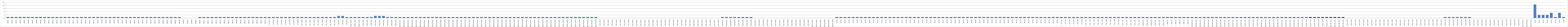
| Category | Series 0 |
|---|---|
| AW01 | 1 |
| AW02 | 1 |
| AW03 | 1 |
| AW04 | 1 |
| AW05 | 1 |
| AW06 | 1 |
| AW07 | 1 |
| AW08 | 1 |
| AW09 | 1 |
| AW10 | 1 |
| AW11 | 1 |
| AW12 | 1 |
| AW13 | 1 |
| AW14 | 1 |
| AW15 | 1 |
| AW16 | 1 |
| AW17 | 1 |
| AW18 | 1 |
| AW19 | 1 |
| AW20 | 1 |
| AW21 | 1 |
| AW22 | 1 |
| AW23 | 1 |
| AW24 | 1 |
| AW25 | 1 |
| AW26 | 1 |
| AW27 | 1 |
| AW28 | 1 |
| AW29 | 1 |
| AW30 | 1 |
| AW31 | 1 |
| AW32 | 1 |
| AW33 | 1 |
| AW34 | 1 |
| AW35 | 1 |
| AW36 | 1 |
| AW37 | 1 |
| AW38 | 1 |
| BW01 | 1 |
| BW02 | 1 |
| BW03 | 1 |
| BWO4 | 1 |
| BW05 | 1 |
| BW06 | 0 |
| BW07 | 0 |
| BW08 | 0 |
| BW09 | 0 |
| BW10 | 1 |
| BW11 | 1 |
| BW12 | 1 |
| BW13 | 1 |
| BW14 | 1 |
| BW15 | 1 |
| BW16 | 1 |
| BW17 | 1 |
| BW18 | 1 |
| BW19 | 1 |
| BW20 | 1 |
| BW21 | 1 |
| BW22 | 1 |
| BW23 | 1 |
| BW24 | 1 |
| BW25 | 1 |
| BW26 | 1 |
| OS.W01 | 1 |
| OS.W02 | 1 |
| OS.W03 | 1 |
| OS.W04 | 1 |
| OS.W05 | 1 |
| OS.W06 | 1 |
| OS.W07 | 1 |
| OS.W08 | 1 |
| OE. W01 | 1 |
| OE. W02 | 1 |
| OE. W03 | 1 |
| OE. W04 | 1 |
| OE. W05 | 1 |
| OE. W06 | 1 |
| OE. W07 | 1 |
| OE. W08 | 1 |
| OE. W09 | 1 |
| OA.W01 | 2 |
| OA.W02 | 2 |
| OA.W03 | 1 |
| OAN. W01 | 1 |
| OAN. W02 | 1 |
| OAN. W03 | 1 |
| OZŚ.W01 | 1 |
| OZŚ.W02 | 1 |
| OZŚ.W03 | 1 |
| OPE.W01 | 2 |
| OPE.W02 | 2 |
| OPE.W03 | 2 |
| OPE.W04 | 1 |
| OPE.W05 | 1 |
| OPE.W06 | 1 |
| B1OD.W01 | 1 |
| B1OD.W02 | 1 |
| B1OD.W03 | 1 |
| B1OD.W04 | 1 |
| B1OD.W05 | 1 |
| B1OD.W06 | 1 |
| B1OD.W07 | 1 |
| B1PZ.W01 | 1 |
| B1PZ.W02 | 1 |
| B1PZ.W03 | 1 |
| B1PZ.W04 | 1 |
| B1PZ.W05 | 1 |
| B1PZ.W06 | 1 |
| B1PZ.W07 | 1 |
| B1PZ.W08 | 1 |
| B1PS.W01 | 1 |
| B1PS.W02 | 1 |
| B1PS.W03 | 1 |
| B1PS.W04 | 1 |
| B1PS.W05 | 1 |
| B1PS.W06 | 1 |
| B1PS.W07 | 1 |
| B1PS.W08 | 1 |
| B1MŚ.W01 | 1 |
| B1MŚ.W02 | 1 |
| B1MŚ.W03 | 1 |
| B1MŚ.W04 | 1 |
| B1MŚ.W05 | 1 |
| B1MŚ.W06 | 1 |
| B1MŚ.W07 | 1 |
| B1MŚ.W08 | 1 |
| B1PO.W01 | 1 |
| B1PO.W02 | 1 |
| B1PO.W03 | 1 |
| B1PO.W04 | 1 |
| B1PO.W05 | 1 |
| B1PO.W06 | 1 |
| B1PO.W07 | 1 |
| B1PO.W08 | 1 |
| B1EL.W01 | 1 |
| B1EL.W02 | 1 |
| B1EL.W03 | 1 |
| B1EL.W04 | 1 |
| B1EL.W05 | 1 |
| B1EL.W06 | 1 |
| B1.PR.W01 | 1 |
| B1.PR.W02 | 1 |
| B1.PR.W03 | 1 |
| B1.PR.W04 | 1 |
| B1S.W01 | 0 |
| B1S.W02 | 0 |
| B1S.W03 | 0 |
| B1S.W04 | 0 |
| B1S.W05 | 0 |
| B1S.W06 | 0 |
| B1S.W07 | 0 |
| B1S.W08 | 0 |
| B2C.W01 | 0 |
| B2C.W02 | 0 |
| B2C.W03 | 0 |
| B2C.W04 | 0 |
| B2C.W05 | 0 |
| B2C.W06 | 0 |
| B2C.W07 | 0 |
| B2C.W08 | 0 |
| B2K.W01 | 0 |
| B2K.W02 | 0 |
| B2K.W03 | 0 |
| B2K.W04 | 0 |
| B2K.W05 | 0 |
| B2K.W06 | 0 |
| B2U.W01 | 0 |
| B2U.W02 | 0 |
| B2U.W03 | 0 |
| B2U.W04 | 0 |
| B2U.W05 | 0 |
| B2U.W06 | 0 |
| B2U.W07 | 0 |
| B2U.W08 | 0 |
| B2N.W01 | 1 |
| B2N.W02 | 1 |
| B2N.W03 | 1 |
| B2N.W04 | 1 |
| B2N.W05 | 1 |
| B2N.W06 | 1 |
| B2N.W07 | 1 |
| B2N.W08 | 1 |
| B2O.W01 | 0 |
| B2O.W02 | 0 |
| B2O.W03 | 0 |
| B2O.W04 | 0 |
| B2O.W05 | 0 |
| B2O.W06 | 0 |
| B2O.W07 | 0 |
| B2O.W08 | 0 |
| B2O.W09 | 0 |
| B2D.W01 | 0 |
| B2D.W02 | 0 |
| B2D.W03 | 0 |
| B2D.W04 | 0 |
| B2D.W05 | 0 |
| B2CH.W01 | 0 |
| B2CH.W02 | 0 |
| B2CH.W03 | 0 |
| B2CH.W04 | 0 |
| B2CH.W05 | 0 |
| B2CH.W06 | 0 |
| AU01 | 1 |
| AU02 | 1 |
| AU03 | 1 |
| AU04 | 1 |
| AU05 | 1 |
| AU06 | 1 |
| AU07 | 1 |
| AU08 | 1 |
| AU09 | 1 |
| AU10 | 1 |
| AU11 | 1 |
| AU12 | 1 |
| AU13 | 1 |
| AU14 | 1 |
| AU15 | 1 |
| AU16 | 1 |
| AU17 | 1 |
| AU18 | 1 |
| AU19 | 1 |
| AU20 | 1 |
| AU21 | 1 |
| AU22 | 1 |
| AU23 | 1 |
| AU24 | 1 |
| AU25 | 1 |
| AU26 | 1 |
| AU27 | 1 |
| AU28 | 1 |
| AU29 | 1 |
| BU01 | 1 |
| BU02 | 1 |
| BU03 | 1 |
| BU04 | 1 |
| BU05 | 1 |
| BU06 | 1 |
| BU07 | 1 |
| BU08 | 1 |
| BU09 | 1 |
| BU10 | 1 |
| BU11 | 1 |
| BU12 | 1 |
| BU13 | 1 |
| BU14 | 1 |
| BU15 | 1 |
| BU16 | 1 |
| BU17 | 1 |
| BU18 | 1 |
| BU19 | 1 |
| BU20 | 1 |
| BU21 | 1 |
| BU22 | 1 |
| BU23 | 1 |
| BU24 | 1 |
| BU25 | 1 |
| BU26 | 1 |
| OS.U01 | 1 |
| OS.U02 | 1 |
| OS.U03 | 1 |
| OS.U04 | 1 |
| OS.U05 | 1 |
| OS.U06 | 1 |
| OE. U01 | 1 |
| OE. U02 | 1 |
| OE. U03 | 1 |
| OE. U04 | 1 |
| OE. U05 | 1 |
| OE. U06 | 1 |
| OE. U07 | 1 |
| OE. U08 | 1 |
| OE. U09 | 1 |
| OA. U01 | 1 |
| OA. U02 | 1 |
| OA. U03 | 1 |
| OA. U04 | 1 |
| OA. U05 | 1 |
| OAN.U01 | 1 |
| OAN.U02 | 1 |
| OAN.U03 | 1 |
| OZŚ.U01 | 1 |
| OZŚ.U02 | 1 |
| OZŚ.U03 | 1 |
| OPE.01 | 1 |
| OPE.02 | 1 |
| OPE.03 | 1 |
| OPE.04 | 1 |
| OPE.05 | 1 |
| OPE.06 | 1 |
| B1OD.U01 | 1 |
| B1OD.U02 | 1 |
| B1OD.U03 | 1 |
| B1OD.U04 | 1 |
| B1OD.U05 | 1 |
| B1OD.U06 | 1 |
| B1OD.U07 | 1 |
| B1OD.U08 | 1 |
| B1PZ.U01 | 1 |
| B1PZ.U02 | 1 |
| B1PZ.U03 | 1 |
| B1PZ.U04 | 1 |
| B1PZ.U05 | 1 |
| B1PS.U01 | 1 |
| B1PS.U02 | 1 |
| B1PS.U03 | 1 |
| B1PS.U04 | 1 |
| B1MŚ.U01 | 1 |
| B1MŚ.U02 | 1 |
| B1MŚ.U03 | 1 |
| B1MŚ.U04 | 1 |
| B1MŚ.U05 | 1 |
| B1PO.U01 | 1 |
| B1PO.U02 | 1 |
| B1PO.U03 | 1 |
| B1PO.U04 | 1 |
| B1PO.U05 | 1 |
| B1EL.U01 | 1 |
| B1EL.U02 | 1 |
| B1EL.U03 | 1 |
| B1EL.U04 | 1 |
| B1EL.U05 | 1 |
| B1EL.U06 | 1 |
| B1EL.U07 | 1 |
| B1.RP.U01 | 1 |
| B1.RP.U02 | 1 |
| B1.RP.U03 | 1 |
| B1.RP.U04 | 1 |
| B2S.U01 | 0 |
| B2S.U02 | 0 |
| B2S.U03 | 0 |
| B2S.U04 | 0 |
| B2S.U05 | 0 |
| B2S.U06 | 0 |
| B2C.U01 | 0 |
| B2C.U02 | 0 |
| B2C.U03 | 0 |
| B2C.U04 | 0 |
| B2C.U05 | 0 |
| B2C.U06 | 0 |
| B2C.U07 | 0 |
| B2K.U01 | 0 |
| B2K.U02 | 0 |
| B2K.U03 | 0 |
| B2K.U04 | 0 |
| B2U.U01 | 0 |
| B2U.U02 | 0 |
| B2U.U03 | 0 |
| B2U.U04 | 0 |
| B2U.U05 | 0 |
| B2U.U06 | 0 |
| B2U.U07 | 0 |
| B2N.U01 | 1 |
| B2N.U02 | 1 |
| B2N.U03 | 1 |
| B2N.U04 | 1 |
| B2N.U05 | 1 |
| B2N.U06 | 1 |
| B2N.U07 | 1 |
| B2O.U01 | 0 |
| B2O.U02 | 0 |
| B2O.U03 | 0 |
| B2O.U04 | 0 |
| B2O.U05 | 0 |
| B2O.U06 | 0 |
| B2O.U07 | 0 |
| B2D.U01 | 0 |
| B2D.U02 | 0 |
| B2D.U03 | 0 |
| B2D.U04 | 0 |
| B2D.U05 | 0 |
| B2CH.U01 | 0 |
| B2CH.U02 | 0 |
| B2CH.U03 | 0 |
| B.K1 | 13 |
| B.K2 | 3 |
| B.K3 | 3 |
| B.K4 | 3 |
| B.K5 | 5 |
| B.K6 | 1 |
| B.K7 | 5 |
| B.K8 | 1 |